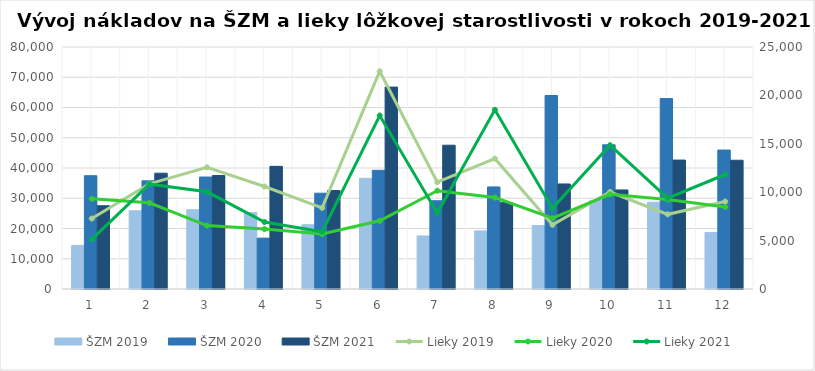
| Category | ŠZM 2019 | ŠZM 2020 | ŠZM 2021 |
|---|---|---|---|
| 0 | 14413.797 | 37451.291 | 27516.529 |
| 1 | 25854.034 | 35763.562 | 38284.784 |
| 2 | 26188.277 | 37012.524 | 37515.753 |
| 3 | 25251.714 | 16822.708 | 40543.488 |
| 4 | 21240.102 | 31663.819 | 32560.129 |
| 5 | 36580.357 | 39235.367 | 66740.927 |
| 6 | 17531.214 | 29166.194 | 47531.814 |
| 7 | 19199.945 | 33748.029 | 28547.337 |
| 8 | 20966.973 | 63962.746 | 34724.632 |
| 9 | 29320.96 | 47664.722 | 32752.745 |
| 10 | 28686.568 | 62949.76 | 42622.381 |
| 11 | 18652.685 | 45929.882 | 42563.029 |